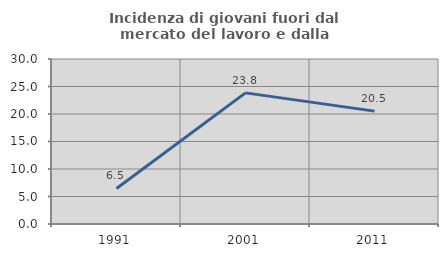
| Category | Incidenza di giovani fuori dal mercato del lavoro e dalla formazione  |
|---|---|
| 1991.0 | 6.46 |
| 2001.0 | 23.841 |
| 2011.0 | 20.522 |